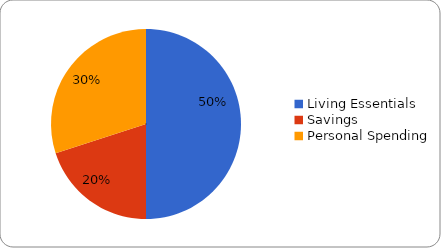
| Category | Series 0 |
|---|---|
| Living Essentials  | 500 |
| Savings | 200 |
| Personal Spending | 300 |